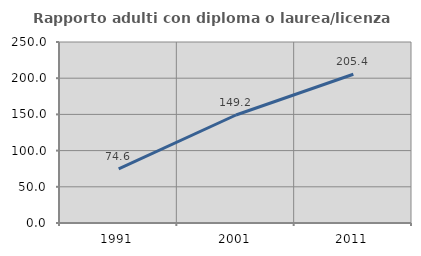
| Category | Rapporto adulti con diploma o laurea/licenza media  |
|---|---|
| 1991.0 | 74.644 |
| 2001.0 | 149.182 |
| 2011.0 | 205.414 |